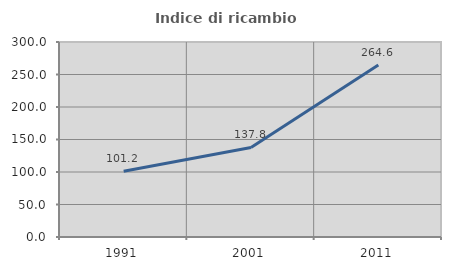
| Category | Indice di ricambio occupazionale  |
|---|---|
| 1991.0 | 101.176 |
| 2001.0 | 137.756 |
| 2011.0 | 264.559 |